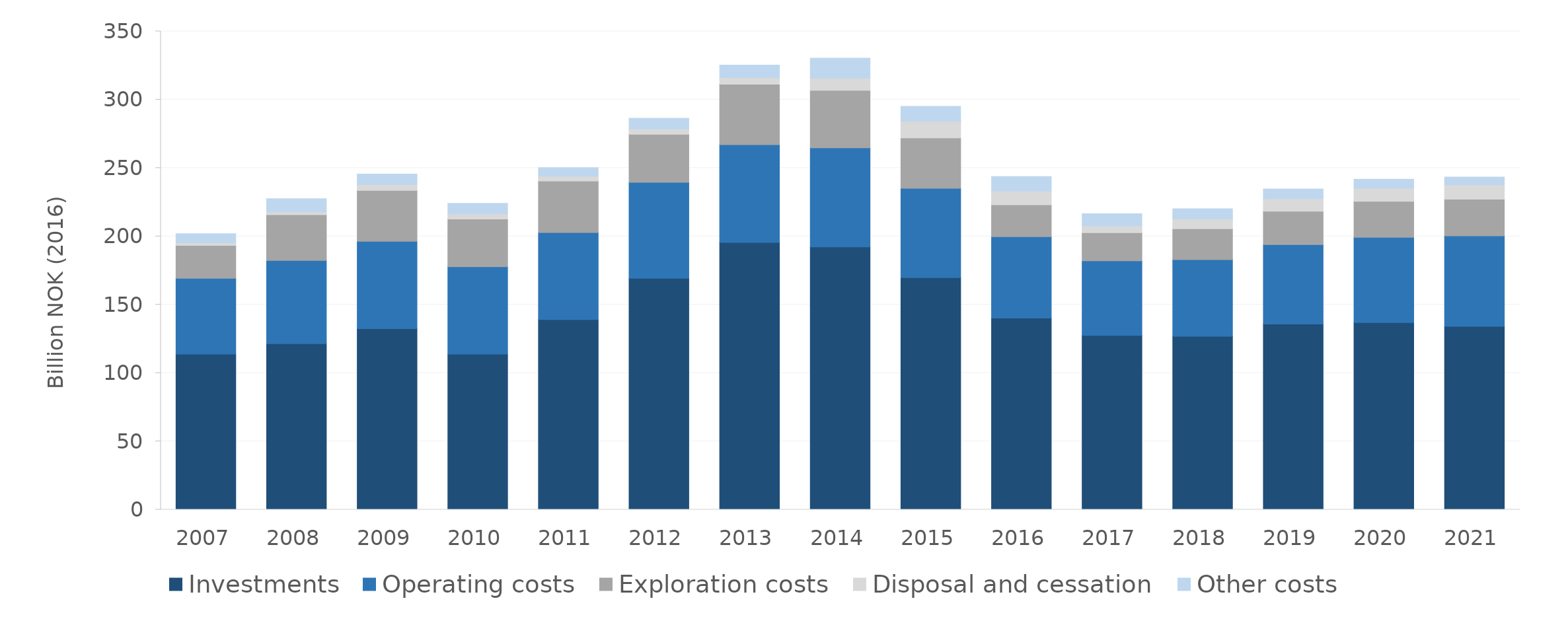
| Category | Investments | Operating costs | Exploration costs | Disposal and cessation | Other costs |
|---|---|---|---|---|---|
| 2007.0 | 113.876 | 55.415 | 24.033 | 1.992 | 6.637 |
| 2008.0 | 121.487 | 60.912 | 33.446 | 2.088 | 9.606 |
| 2009.0 | 132.437 | 63.969 | 37.176 | 4.37 | 7.643 |
| 2010.0 | 113.858 | 63.97 | 34.84 | 3.846 | 7.66 |
| 2011.0 | 139.053 | 63.692 | 37.713 | 3.543 | 6.332 |
| 2012.0 | 169.37 | 70.2 | 35.139 | 3.807 | 7.903 |
| 2013.0 | 195.518 | 71.566 | 44.227 | 4.82 | 9.222 |
| 2014.0 | 192.287 | 72.457 | 42.14 | 8.746 | 14.819 |
| 2015.0 | 169.859 | 65.344 | 36.86 | 12.184 | 10.853 |
| 2016.0 | 140.228 | 59.557 | 23.333 | 9.997 | 10.7 |
| 2017.0 | 127.522 | 54.641 | 20.471 | 4.981 | 8.919 |
| 2018.0 | 126.869 | 56.08 | 22.645 | 7.059 | 7.576 |
| 2019.0 | 135.852 | 58.169 | 24.33 | 9.252 | 7.053 |
| 2020.0 | 136.896 | 62.441 | 26.31 | 9.717 | 6.463 |
| 2021.0 | 134.109 | 66.255 | 26.848 | 10.417 | 5.77 |